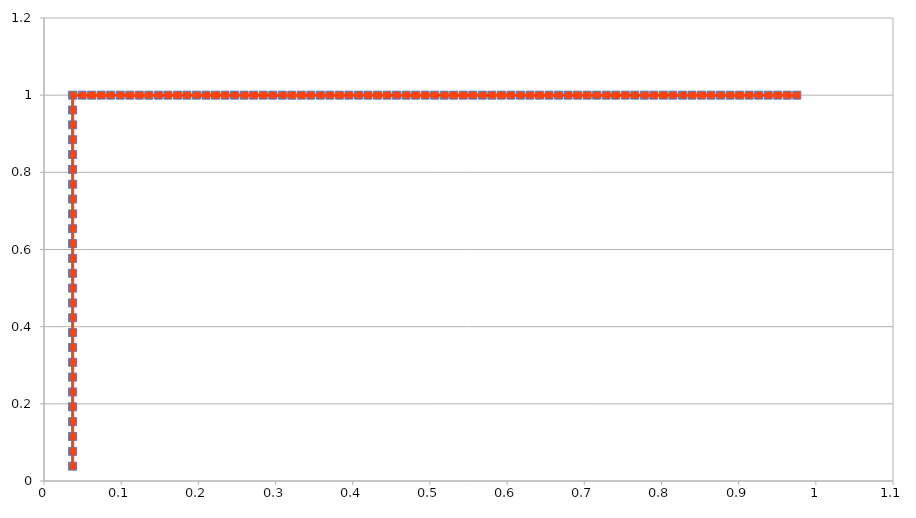
| Category | Series 0 |
|---|---|
| 0.0370370370370371 | 0.038 |
| 0.0370370370370371 | 0.077 |
| 0.0370370370370371 | 0.115 |
| 0.0370370370370371 | 0.154 |
| 0.0370370370370371 | 0.192 |
| 0.0370370370370371 | 0.231 |
| 0.0370370370370371 | 0.269 |
| 0.0370370370370371 | 0.308 |
| 0.0370370370370371 | 0.346 |
| 0.0370370370370371 | 0.385 |
| 0.0370370370370371 | 0.423 |
| 0.0370370370370371 | 0.462 |
| 0.0370370370370371 | 0.5 |
| 0.0370370370370371 | 0.538 |
| 0.0370370370370371 | 0.577 |
| 0.0370370370370371 | 0.615 |
| 0.0370370370370371 | 0.654 |
| 0.0370370370370371 | 0.692 |
| 0.0370370370370371 | 0.731 |
| 0.0370370370370371 | 0.769 |
| 0.0370370370370371 | 0.808 |
| 0.0370370370370371 | 0.846 |
| 0.0370370370370371 | 0.885 |
| 0.0370370370370371 | 0.923 |
| 0.0370370370370371 | 0.962 |
| 0.0370370370370371 | 1 |
| 0.0493827160493827 | 1 |
| 0.0617283950617285 | 1 |
| 0.0740740740740741 | 1 |
| 0.0864197530864198 | 1 |
| 0.0987654320987654 | 1 |
| 0.111111111111111 | 1 |
| 0.123456790123457 | 1 |
| 0.135802469135803 | 1 |
| 0.148148148148148 | 1 |
| 0.160493827160494 | 1 |
| 0.17283950617284 | 1 |
| 0.185185185185185 | 1 |
| 0.197530864197531 | 1 |
| 0.209876543209877 | 1 |
| 0.222222222222222 | 1 |
| 0.234567901234568 | 1 |
| 0.246913580246914 | 1 |
| 0.259259259259259 | 1 |
| 0.271604938271605 | 1 |
| 0.283950617283951 | 1 |
| 0.296296296296296 | 1 |
| 0.308641975308642 | 1 |
| 0.320987654320988 | 1 |
| 0.333333333333333 | 1 |
| 0.345679012345679 | 1 |
| 0.358024691358025 | 1 |
| 0.37037037037037 | 1 |
| 0.382716049382716 | 1 |
| 0.395061728395062 | 1 |
| 0.407407407407407 | 1 |
| 0.419753086419753 | 1 |
| 0.432098765432099 | 1 |
| 0.444444444444444 | 1 |
| 0.45679012345679 | 1 |
| 0.469135802469136 | 1 |
| 0.481481481481482 | 1 |
| 0.493827160493827 | 1 |
| 0.506172839506173 | 1 |
| 0.518518518518519 | 1 |
| 0.530864197530864 | 1 |
| 0.54320987654321 | 1 |
| 0.555555555555556 | 1 |
| 0.567901234567901 | 1 |
| 0.580246913580247 | 1 |
| 0.592592592592593 | 1 |
| 0.604938271604938 | 1 |
| 0.617283950617284 | 1 |
| 0.62962962962963 | 1 |
| 0.641975308641975 | 1 |
| 0.654320987654321 | 1 |
| 0.666666666666667 | 1 |
| 0.679012345679012 | 1 |
| 0.691358024691358 | 1 |
| 0.703703703703704 | 1 |
| 0.71604938271605 | 1 |
| 0.728395061728395 | 1 |
| 0.740740740740741 | 1 |
| 0.753086419753086 | 1 |
| 0.765432098765432 | 1 |
| 0.777777777777778 | 1 |
| 0.790123456790123 | 1 |
| 0.802469135802469 | 1 |
| 0.814814814814815 | 1 |
| 0.827160493827161 | 1 |
| 0.839506172839506 | 1 |
| 0.851851851851852 | 1 |
| 0.864197530864198 | 1 |
| 0.876543209876543 | 1 |
| 0.888888888888889 | 1 |
| 0.901234567901235 | 1 |
| 0.91358024691358 | 1 |
| 0.925925925925926 | 1 |
| 0.938271604938272 | 1 |
| 0.950617283950617 | 1 |
| 0.962962962962963 | 1 |
| 0.975308641975309 | 1 |